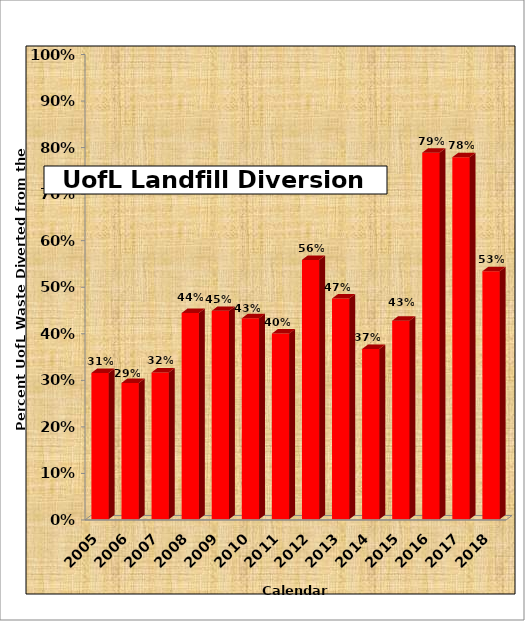
| Category | Calendar Year |
|---|---|
| 2018 | 0.533 |
| 2017 | 0.778 |
| 2016 | 0.788 |
| 2015 | 0.427 |
| 2014 | 0.366 |
| 2013 | 0.474 |
| 2012 | 0.557 |
| 2011 | 0.399 |
| 2010 | 0.432 |
| 2009 | 0.448 |
| 2008 | 0.443 |
| 2007 | 0.315 |
| 2006 | 0.293 |
| 2005 | 0.314 |